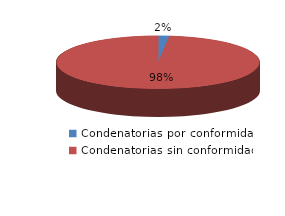
| Category | Series 0 |
|---|---|
| 0 | 1 |
| 1 | 56 |